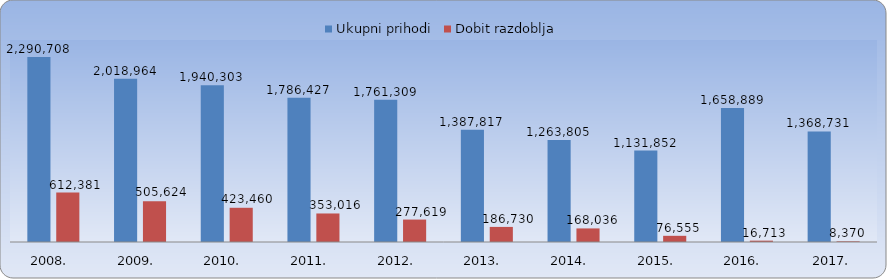
| Category | Ukupni prihodi | Dobit razdoblja |
|---|---|---|
| 2008.  | 2290708.434 | 612381.424 |
| 2009.  | 2018963.819 | 505624.269 |
| 2010.  | 1940303.308 | 423460.256 |
| 2011.  | 1786427.019 | 353016.469 |
| 2012.  | 1761308.677 | 277619.246 |
| 2013.  | 1387817.317 | 186729.641 |
| 2014.  | 1263804.577 | 168035.945 |
| 2015.  | 1131852.107 | 76555.198 |
| 2016.  | 1658888.864 | 16713.43 |
| 2017. | 1368731.237 | 8369.664 |